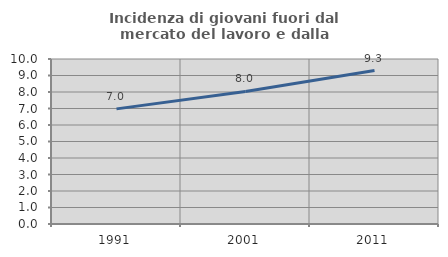
| Category | Incidenza di giovani fuori dal mercato del lavoro e dalla formazione  |
|---|---|
| 1991.0 | 6.977 |
| 2001.0 | 8.034 |
| 2011.0 | 9.297 |